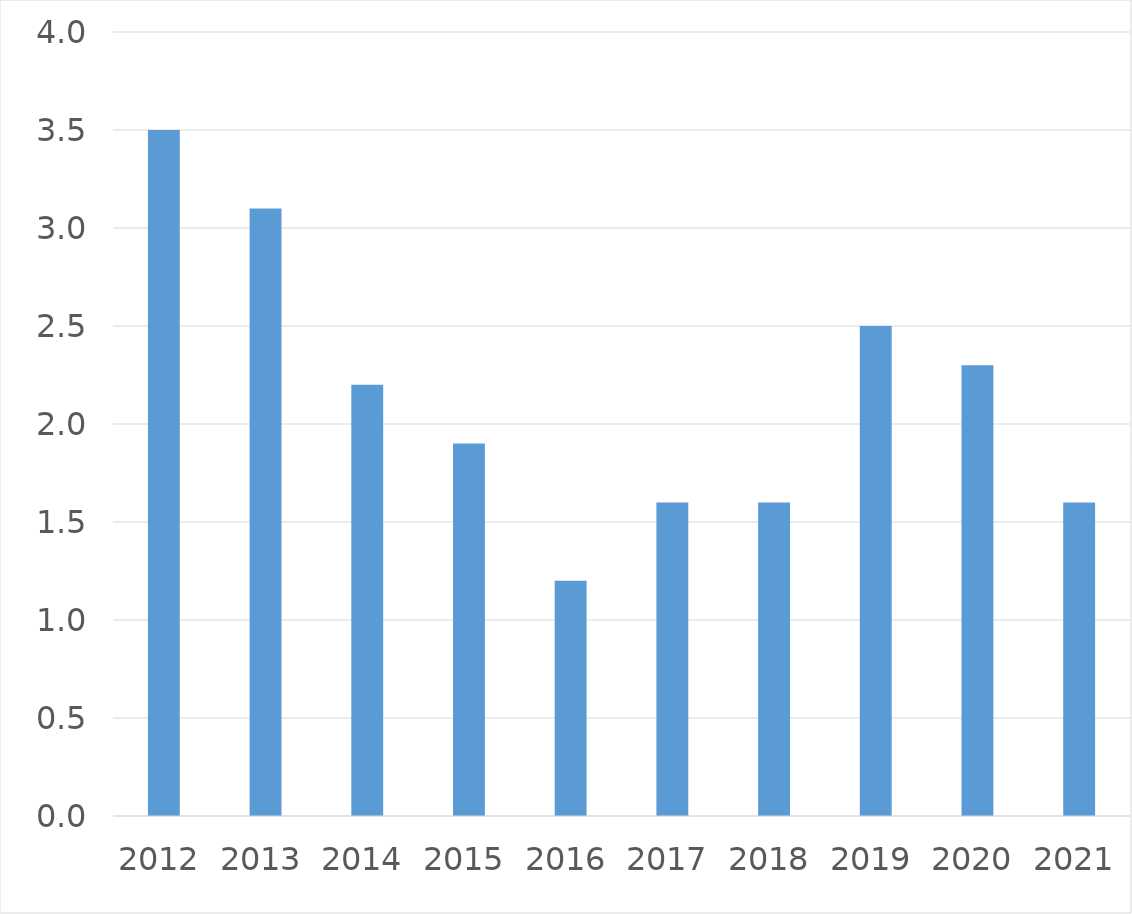
| Category | Series 0 |
|---|---|
| 2012 | 3.5 |
| 2013 | 3.1 |
| 2014 | 2.2 |
| 2015 | 1.9 |
| 2016 | 1.2 |
| 2017 | 1.6 |
| 2018 | 1.6 |
| 2019 | 2.5 |
| 2020 | 2.3 |
| 2021 | 1.6 |